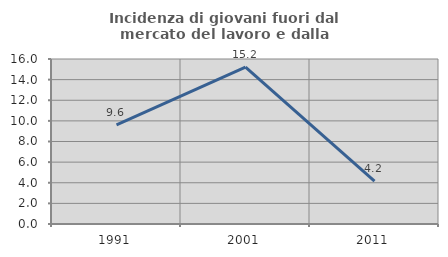
| Category | Incidenza di giovani fuori dal mercato del lavoro e dalla formazione  |
|---|---|
| 1991.0 | 9.615 |
| 2001.0 | 15.217 |
| 2011.0 | 4.167 |